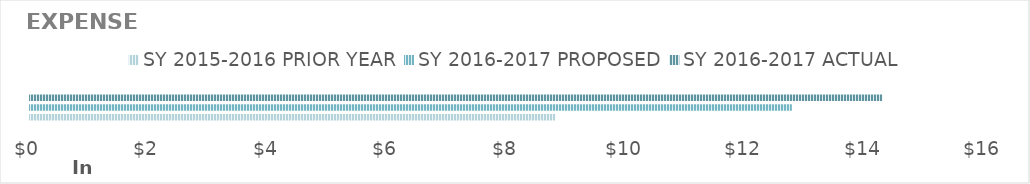
| Category | SY 2015-2016 | SY 2016-2017 |
|---|---|---|
| 0 | 8802.4 | 14281.75 |